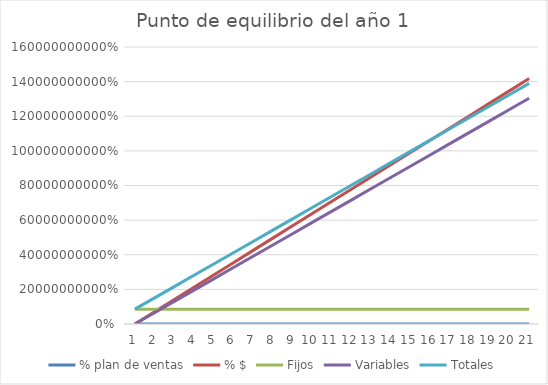
| Category | % plan de ventas | % $ | Fijos | Variables | Totales |
|---|---|---|---|---|---|
| 0 | 0 | 0 | 85738707.514 | 0 | 85738707.514 |
| 1 | 0.05 | 70875000 | 85738707.514 | 65196904.33 | 150935611.845 |
| 2 | 0.1 | 141750000 | 85738707.514 | 130393808.66 | 216132516.175 |
| 3 | 0.15 | 212625000 | 85738707.514 | 195590712.99 | 281329420.505 |
| 4 | 0.2 | 283500000 | 85738707.514 | 260787617.32 | 346526324.835 |
| 5 | 0.25 | 354375000 | 85738707.514 | 325984521.651 | 411723229.165 |
| 6 | 0.3 | 425250000 | 85738707.514 | 391181425.981 | 476920133.495 |
| 7 | 0.35 | 496125000 | 85738707.514 | 456378330.311 | 542117037.825 |
| 8 | 0.4 | 567000000 | 85738707.514 | 521575234.641 | 607313942.155 |
| 9 | 0.45 | 637875000 | 85738707.514 | 586772138.971 | 672510846.485 |
| 10 | 0.5 | 708750000 | 85738707.514 | 651969043.301 | 737707750.815 |
| 11 | 0.55 | 779625000 | 85738707.514 | 717165947.631 | 802904655.146 |
| 12 | 0.6 | 850500000 | 85738707.514 | 782362851.961 | 868101559.476 |
| 13 | 0.65 | 921375000 | 85738707.514 | 847559756.291 | 933298463.806 |
| 14 | 0.7 | 992250000 | 85738707.514 | 912756660.621 | 998495368.136 |
| 15 | 0.75 | 1063125000 | 85738707.514 | 977953564.952 | 1063692272.466 |
| 16 | 0.8 | 1134000000 | 85738707.514 | 1043150469.282 | 1128889176.796 |
| 17 | 0.85 | 1204875000 | 85738707.514 | 1108347373.612 | 1194086081.126 |
| 18 | 0.9 | 1275750000 | 85738707.514 | 1173544277.942 | 1259282985.456 |
| 19 | 0.95 | 1346625000 | 85738707.514 | 1238741182.272 | 1324479889.786 |
| 20 | 1 | 1417500000 | 85738707.514 | 1303938086.602 | 1389676794.116 |